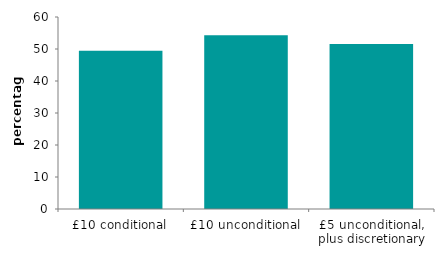
| Category | Series 0 |
|---|---|
| £10 conditional | 49.44 |
| £10 unconditional | 54.27 |
| £5 unconditional, plus discretionary | 51.537 |